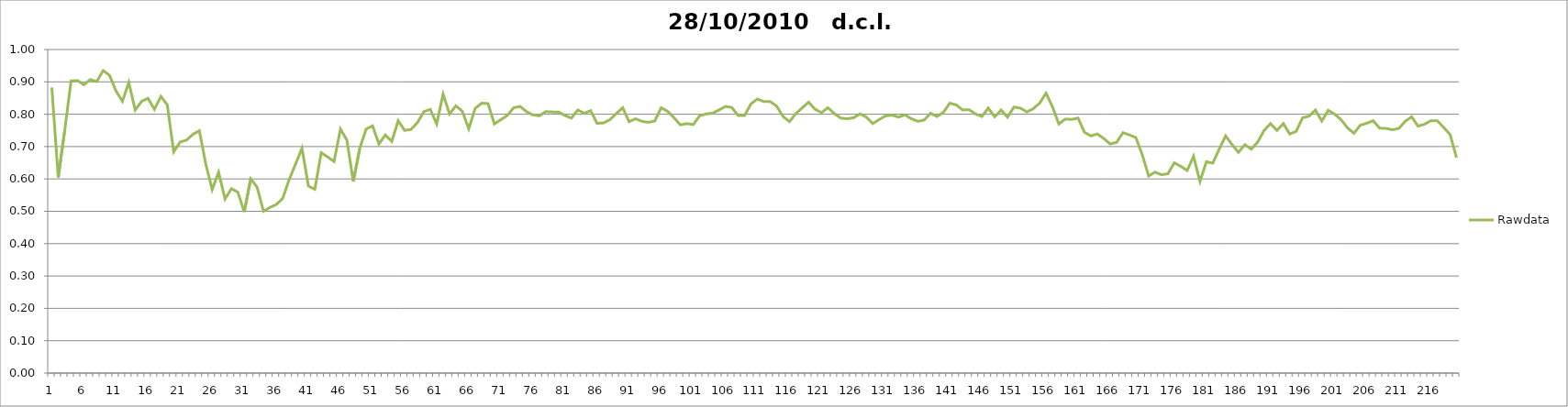
| Category | Rawdata |
|---|---|
| 0 | 0.883 |
| 1 | 0.604 |
| 2 | 0.749 |
| 3 | 0.903 |
| 4 | 0.904 |
| 5 | 0.891 |
| 6 | 0.907 |
| 7 | 0.901 |
| 8 | 0.935 |
| 9 | 0.92 |
| 10 | 0.872 |
| 11 | 0.84 |
| 12 | 0.898 |
| 13 | 0.813 |
| 14 | 0.84 |
| 15 | 0.849 |
| 16 | 0.815 |
| 17 | 0.855 |
| 18 | 0.829 |
| 19 | 0.684 |
| 20 | 0.714 |
| 21 | 0.72 |
| 22 | 0.738 |
| 23 | 0.749 |
| 24 | 0.646 |
| 25 | 0.567 |
| 26 | 0.621 |
| 27 | 0.538 |
| 28 | 0.57 |
| 29 | 0.559 |
| 30 | 0.498 |
| 31 | 0.6 |
| 32 | 0.575 |
| 33 | 0.5 |
| 34 | 0.512 |
| 35 | 0.521 |
| 36 | 0.54 |
| 37 | 0.598 |
| 38 | 0.646 |
| 39 | 0.695 |
| 40 | 0.578 |
| 41 | 0.568 |
| 42 | 0.681 |
| 43 | 0.668 |
| 44 | 0.654 |
| 45 | 0.754 |
| 46 | 0.72 |
| 47 | 0.592 |
| 48 | 0.694 |
| 49 | 0.754 |
| 50 | 0.764 |
| 51 | 0.708 |
| 52 | 0.736 |
| 53 | 0.716 |
| 54 | 0.78 |
| 55 | 0.75 |
| 56 | 0.753 |
| 57 | 0.774 |
| 58 | 0.808 |
| 59 | 0.815 |
| 60 | 0.77 |
| 61 | 0.862 |
| 62 | 0.801 |
| 63 | 0.826 |
| 64 | 0.809 |
| 65 | 0.755 |
| 66 | 0.818 |
| 67 | 0.834 |
| 68 | 0.833 |
| 69 | 0.77 |
| 70 | 0.783 |
| 71 | 0.796 |
| 72 | 0.82 |
| 73 | 0.824 |
| 74 | 0.808 |
| 75 | 0.798 |
| 76 | 0.795 |
| 77 | 0.808 |
| 78 | 0.807 |
| 79 | 0.807 |
| 80 | 0.796 |
| 81 | 0.788 |
| 82 | 0.813 |
| 83 | 0.803 |
| 84 | 0.811 |
| 85 | 0.772 |
| 86 | 0.773 |
| 87 | 0.783 |
| 88 | 0.802 |
| 89 | 0.82 |
| 90 | 0.777 |
| 91 | 0.786 |
| 92 | 0.778 |
| 93 | 0.775 |
| 94 | 0.779 |
| 95 | 0.82 |
| 96 | 0.809 |
| 97 | 0.789 |
| 98 | 0.767 |
| 99 | 0.771 |
| 100 | 0.768 |
| 101 | 0.795 |
| 102 | 0.801 |
| 103 | 0.803 |
| 104 | 0.813 |
| 105 | 0.824 |
| 106 | 0.821 |
| 107 | 0.796 |
| 108 | 0.796 |
| 109 | 0.832 |
| 110 | 0.847 |
| 111 | 0.839 |
| 112 | 0.839 |
| 113 | 0.825 |
| 114 | 0.793 |
| 115 | 0.777 |
| 116 | 0.802 |
| 117 | 0.82 |
| 118 | 0.837 |
| 119 | 0.815 |
| 120 | 0.805 |
| 121 | 0.82 |
| 122 | 0.802 |
| 123 | 0.788 |
| 124 | 0.786 |
| 125 | 0.789 |
| 126 | 0.801 |
| 127 | 0.791 |
| 128 | 0.771 |
| 129 | 0.784 |
| 130 | 0.795 |
| 131 | 0.797 |
| 132 | 0.791 |
| 133 | 0.798 |
| 134 | 0.786 |
| 135 | 0.778 |
| 136 | 0.782 |
| 137 | 0.803 |
| 138 | 0.793 |
| 139 | 0.806 |
| 140 | 0.834 |
| 141 | 0.829 |
| 142 | 0.813 |
| 143 | 0.814 |
| 144 | 0.801 |
| 145 | 0.793 |
| 146 | 0.819 |
| 147 | 0.792 |
| 148 | 0.813 |
| 149 | 0.791 |
| 150 | 0.822 |
| 151 | 0.819 |
| 152 | 0.807 |
| 153 | 0.817 |
| 154 | 0.834 |
| 155 | 0.865 |
| 156 | 0.823 |
| 157 | 0.77 |
| 158 | 0.785 |
| 159 | 0.784 |
| 160 | 0.788 |
| 161 | 0.744 |
| 162 | 0.733 |
| 163 | 0.739 |
| 164 | 0.725 |
| 165 | 0.708 |
| 166 | 0.713 |
| 167 | 0.743 |
| 168 | 0.736 |
| 169 | 0.728 |
| 170 | 0.675 |
| 171 | 0.609 |
| 172 | 0.621 |
| 173 | 0.613 |
| 174 | 0.616 |
| 175 | 0.65 |
| 176 | 0.639 |
| 177 | 0.626 |
| 178 | 0.67 |
| 179 | 0.592 |
| 180 | 0.653 |
| 181 | 0.649 |
| 182 | 0.692 |
| 183 | 0.733 |
| 184 | 0.706 |
| 185 | 0.682 |
| 186 | 0.706 |
| 187 | 0.692 |
| 188 | 0.714 |
| 189 | 0.75 |
| 190 | 0.771 |
| 191 | 0.75 |
| 192 | 0.771 |
| 193 | 0.739 |
| 194 | 0.747 |
| 195 | 0.789 |
| 196 | 0.794 |
| 197 | 0.813 |
| 198 | 0.779 |
| 199 | 0.812 |
| 200 | 0.8 |
| 201 | 0.783 |
| 202 | 0.758 |
| 203 | 0.741 |
| 204 | 0.766 |
| 205 | 0.772 |
| 206 | 0.78 |
| 207 | 0.757 |
| 208 | 0.756 |
| 209 | 0.752 |
| 210 | 0.756 |
| 211 | 0.778 |
| 212 | 0.792 |
| 213 | 0.763 |
| 214 | 0.769 |
| 215 | 0.78 |
| 216 | 0.78 |
| 217 | 0.759 |
| 218 | 0.737 |
| 219 | 0.666 |